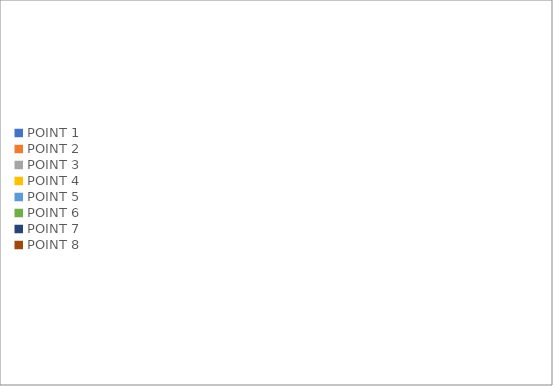
| Category | Series 0 | Series 1 |
|---|---|---|
| POINT 1 | 0 | 0 |
| POINT 2 | 0 | 0 |
| POINT 3 | 0 | 0 |
| POINT 4 | 0 | 0 |
| POINT 5 | 0 | 0 |
| POINT 6 | 0 | 0 |
| POINT 7 | 0 | 0 |
| POINT 8 | 0 | 0 |